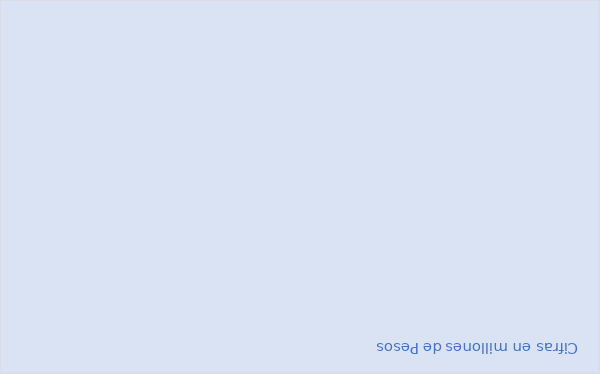
| Category | RESERVAS CONSTITUIDAS
 | CANCELACIONES RESERVAS PRESUPUESTALES
  | PAGOS
ACUMULADOS
 |
|---|---|---|---|
| Total | 12610.763 | 112.613 | 12354.15 |